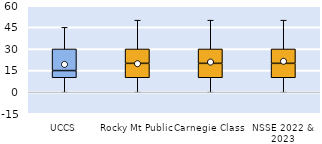
| Category | 25th | 50th | 75th |
|---|---|---|---|
| UCCS | 10 | 5 | 15 |
| Rocky Mt Public | 10 | 10 | 10 |
| Carnegie Class | 10 | 10 | 10 |
| NSSE 2022 & 2023 | 10 | 10 | 10 |